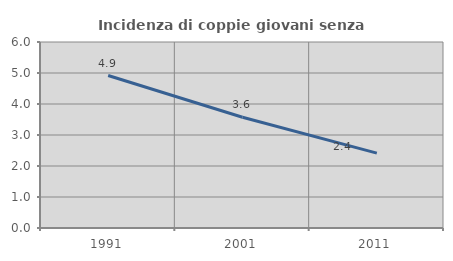
| Category | Incidenza di coppie giovani senza figli |
|---|---|
| 1991.0 | 4.918 |
| 2001.0 | 3.571 |
| 2011.0 | 2.415 |